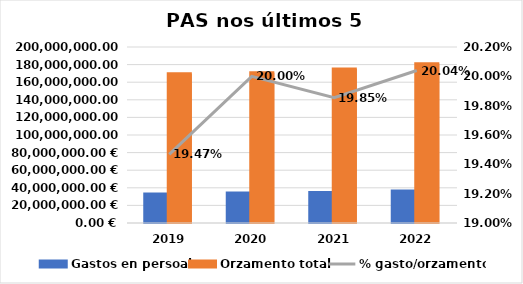
| Category | Gastos en persoal | Orzamento total |
|---|---|---|
| 2019.0 | 33041828.83 | 169720733.3 |
| 2020.0 | 34136555.31 | 170681126.09 |
| 2021.0 | 34770547.71 | 175131206.4 |
| 2022.0 | 36267915.09 | 180980048.67 |